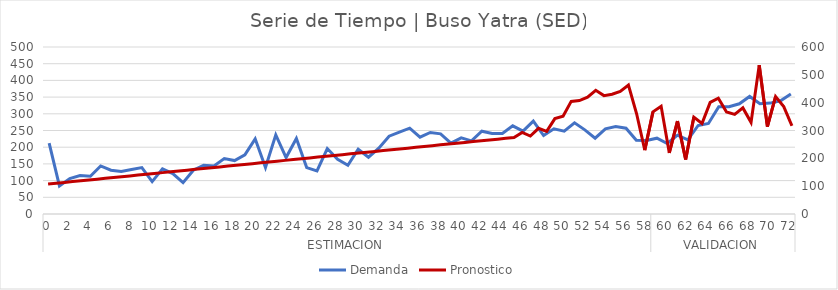
| Category | Demanda |
|---|---|
| 0 | 212 |
| 1 | 84 |
| 2 | 106 |
| 3 | 115 |
| 4 | 113 |
| 5 | 144 |
| 6 | 131 |
| 7 | 127 |
| 8 | 133 |
| 9 | 139 |
| 10 | 97 |
| 11 | 135 |
| 12 | 121 |
| 13 | 94 |
| 14 | 131 |
| 15 | 146 |
| 16 | 144 |
| 17 | 166 |
| 18 | 160 |
| 19 | 177 |
| 20 | 225 |
| 21 | 139 |
| 22 | 237 |
| 23 | 169 |
| 24 | 226 |
| 25 | 139 |
| 26 | 129 |
| 27 | 196 |
| 28 | 164 |
| 29 | 146 |
| 30 | 194 |
| 31 | 170 |
| 32 | 197 |
| 33 | 233 |
| 34 | 245 |
| 35 | 257 |
| 36 | 230 |
| 37 | 244 |
| 38 | 240 |
| 39 | 212 |
| 40 | 228 |
| 41 | 219 |
| 42 | 248 |
| 43 | 241 |
| 44 | 241 |
| 45 | 264 |
| 46 | 248 |
| 47 | 278 |
| 48 | 235 |
| 49 | 255 |
| 50 | 248 |
| 51 | 273 |
| 52 | 252 |
| 53 | 227 |
| 54 | 255 |
| 55 | 262 |
| 56 | 257 |
| 57 | 221 |
| 58 | 220 |
| 59 | 227 |
| 60 | 211 |
| 61 | 236 |
| 62 | 222 |
| 63 | 265 |
| 64 | 271 |
| 65 | 321 |
| 66 | 321 |
| 67 | 330 |
| 68 | 352 |
| 69 | 330 |
| 70 | 332 |
| 71 | 339 |
| 72 | 359 |